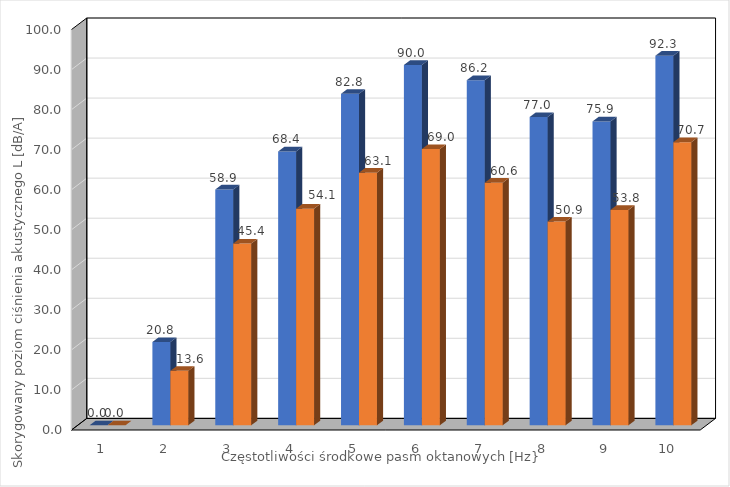
| Category | Series 0 | Series 1 |
|---|---|---|
| 0 | 0 | 0 |
| 1 | 20.8 | 13.6 |
| 2 | 58.9 | 45.4 |
| 3 | 68.4 | 54.1 |
| 4 | 82.8 | 63.1 |
| 5 | 90 | 69 |
| 6 | 86.2 | 60.6 |
| 7 | 77 | 50.9 |
| 8 | 75.9 | 53.8 |
| 9 | 92.315 | 70.714 |